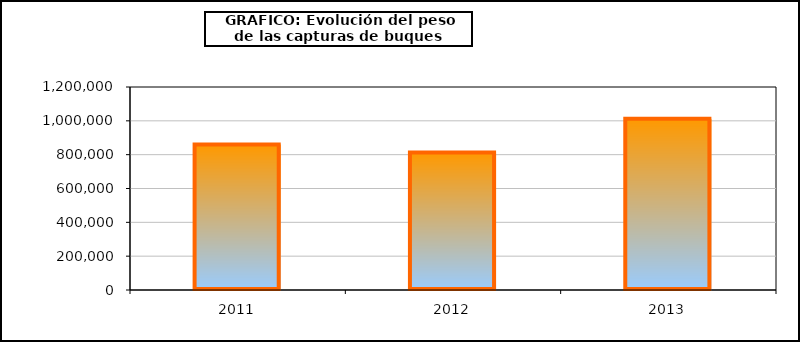
| Category | Series 0 |
|---|---|
| 0 | 860220.944 |
| 1 | 813197.173 |
| 2 | 1012433.853 |